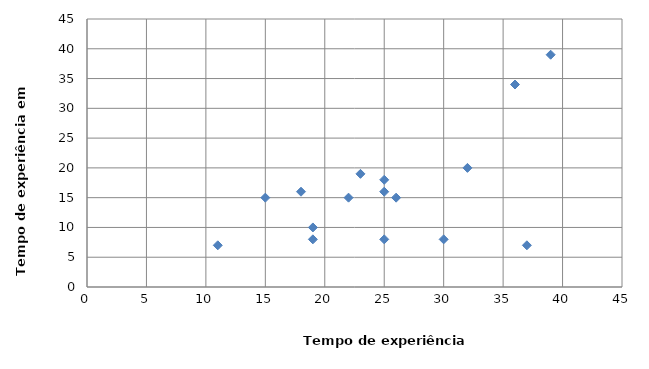
| Category | Tempo de experiência em GP |
|---|---|
| 39.0 | 39 |
| 36.0 | 34 |
| 18.0 | 16 |
| 19.0 | 8 |
| 25.0 | 18 |
| 23.0 | 19 |
| 22.0 | 15 |
| 25.0 | 8 |
| 19.0 | 10 |
| 26.0 | 15 |
| 25.0 | 16 |
| 37.0 | 7 |
| 15.0 | 15 |
| 30.0 | 8 |
| 32.0 | 20 |
| 11.0 | 7 |